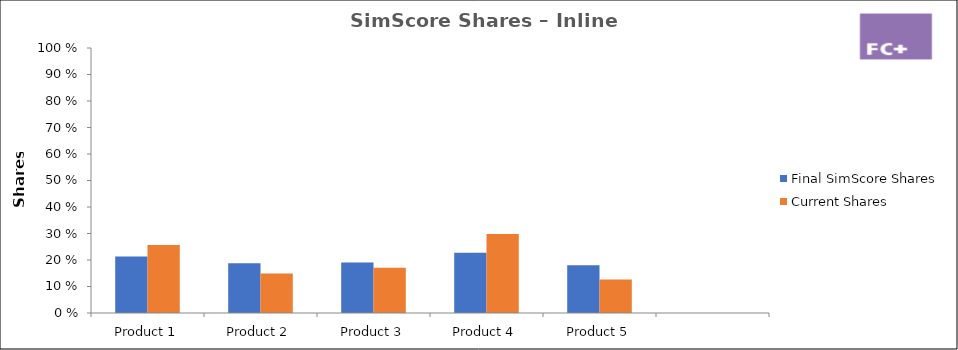
| Category | Final SimScore Shares | Current Shares |
|---|---|---|
| Product 1 | 0.214 | 0.256 |
| Product 2 | 0.188 | 0.149 |
| Product 3 | 0.191 | 0.171 |
| Product 4 | 0.228 | 0.298 |
| Product 5 | 0.18 | 0.126 |